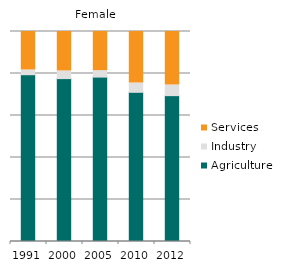
| Category | Agriculture | Industry | Services |
|---|---|---|---|
| 1991.0 | 79.42 | 2.267 | 18.313 |
| 2000.0 | 77.568 | 3.654 | 18.778 |
| 2005.0 | 78.293 | 3.056 | 18.651 |
| 2010.0 | 71.043 | 4.433 | 24.523 |
| 2012.0 | 69.459 | 5.078 | 25.463 |